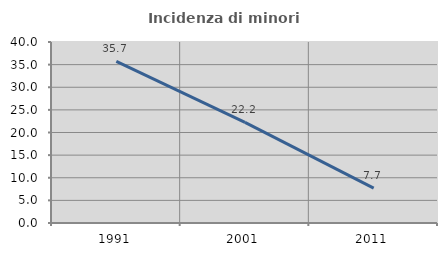
| Category | Incidenza di minori stranieri |
|---|---|
| 1991.0 | 35.714 |
| 2001.0 | 22.222 |
| 2011.0 | 7.692 |